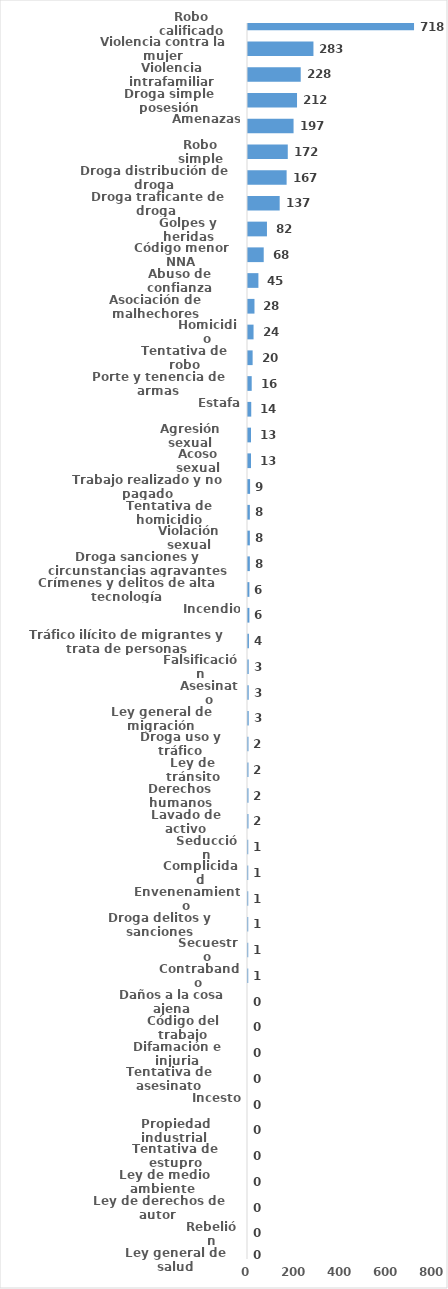
| Category | Series 0 |
|---|---|
| Robo calificado | 718 |
| Violencia contra la mujer | 283 |
| Violencia intrafamiliar | 228 |
| Droga simple posesión | 212 |
| Amenazas | 197 |
| Robo simple | 172 |
| Droga distribución de droga | 167 |
| Droga traficante de droga  | 137 |
| Golpes y heridas | 82 |
| Código menor NNA | 68 |
| Abuso de confianza | 45 |
| Asociación de malhechores | 28 |
| Homicidio | 24 |
| Tentativa de robo | 20 |
| Porte y tenencia de armas | 16 |
| Estafa | 14 |
| Agresión sexual | 13 |
| Acoso sexual | 13 |
| Trabajo realizado y no pagado | 9 |
| Tentativa de homicidio | 8 |
| Violación sexual | 8 |
| Droga sanciones y circunstancias agravantes | 8 |
| Crímenes y delitos de alta tecnología | 6 |
| Incendio | 6 |
| Tráfico ilícito de migrantes y trata de personas | 4 |
| Falsificación | 3 |
| Asesinato | 3 |
| Ley general de migración | 3 |
| Droga uso y tráfico | 2 |
| Ley de tránsito | 2 |
| Derechos humanos | 2 |
| Lavado de activo | 2 |
| Seducción | 1 |
| Complicidad | 1 |
| Envenenamiento | 1 |
| Droga delitos y sanciones | 1 |
| Secuestro | 1 |
| Contrabando | 1 |
| Daños a la cosa ajena | 0 |
| Código del trabajo | 0 |
| Difamación e injuria | 0 |
| Tentativa de asesinato | 0 |
| Incesto | 0 |
| Propiedad industrial  | 0 |
| Tentativa de estupro | 0 |
| Ley de medio ambiente  | 0 |
| Ley de derechos de autor  | 0 |
| Rebelión | 0 |
| Ley general de salud | 0 |